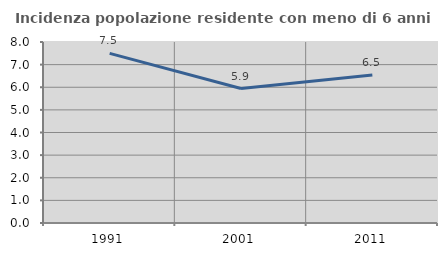
| Category | Incidenza popolazione residente con meno di 6 anni |
|---|---|
| 1991.0 | 7.499 |
| 2001.0 | 5.944 |
| 2011.0 | 6.546 |